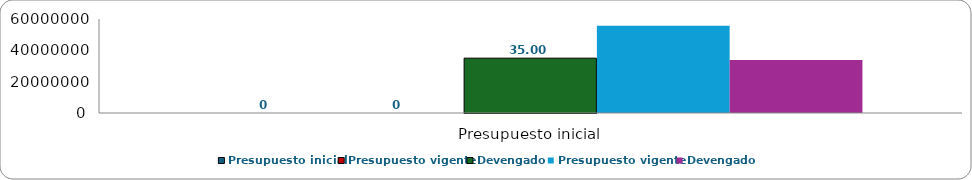
| Category | Presupuesto inicial | Presupuesto vigente | Devengado |
|---|---|---|---|
| Presupuesto inicial | 0 | 55714373.75 | 33813962.98 |